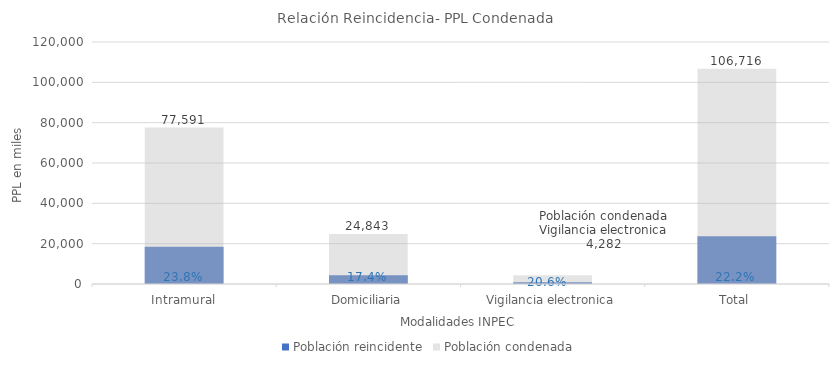
| Category | Población reincidente | Población condenada |
|---|---|---|
| Intramural | 18446 | 77591 |
| Domiciliaria | 4331 | 24843 |
| Vigilancia electronica | 882 | 4282 |
| Total | 23659 | 106716 |